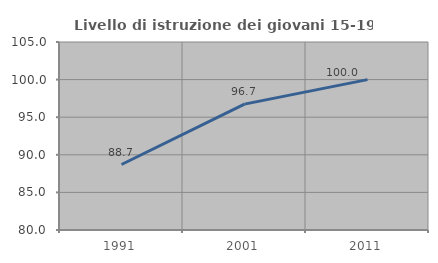
| Category | Livello di istruzione dei giovani 15-19 anni |
|---|---|
| 1991.0 | 88.71 |
| 2001.0 | 96.739 |
| 2011.0 | 100 |